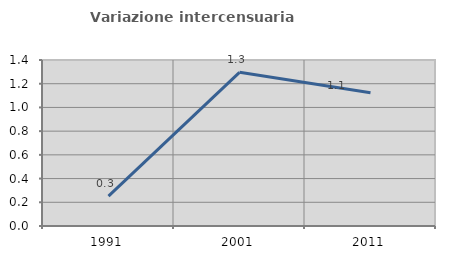
| Category | Variazione intercensuaria annua |
|---|---|
| 1991.0 | 0.252 |
| 2001.0 | 1.296 |
| 2011.0 | 1.124 |